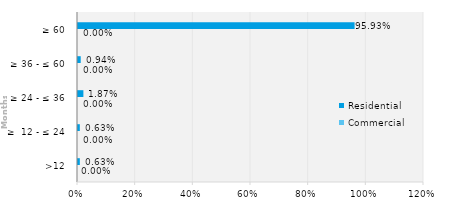
| Category | Commercial | Residential |
|---|---|---|
| >12 | 0 | 0.006 |
| ≥  12 - ≤ 24 | 0 | 0.006 |
| ≥ 24 - ≤ 36 | 0 | 0.019 |
| ≥ 36 - ≤ 60 | 0 | 0.009 |
| ≥ 60 | 0 | 0.959 |